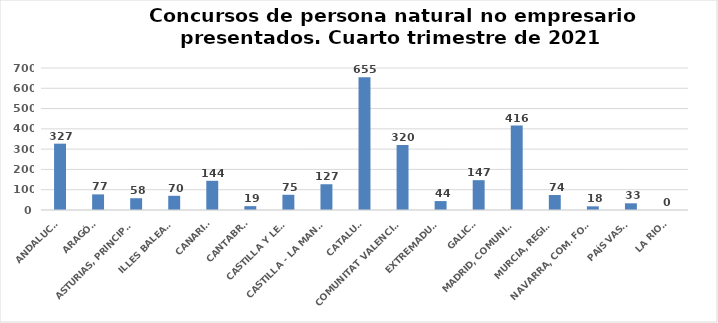
| Category | Series 0 |
|---|---|
| ANDALUCÍA | 327 |
| ARAGÓN | 77 |
| ASTURIAS, PRINCIPADO | 58 |
| ILLES BALEARS | 70 |
| CANARIAS | 144 |
| CANTABRIA | 19 |
| CASTILLA Y LEÓN | 75 |
| CASTILLA - LA MANCHA | 127 |
| CATALUÑA | 655 |
| COMUNITAT VALENCIANA | 320 |
| EXTREMADURA | 44 |
| GALICIA | 147 |
| MADRID, COMUNIDAD | 416 |
| MURCIA, REGIÓN | 74 |
| NAVARRA, COM. FORAL | 18 |
| PAÍS VASCO | 33 |
| LA RIOJA | 0 |